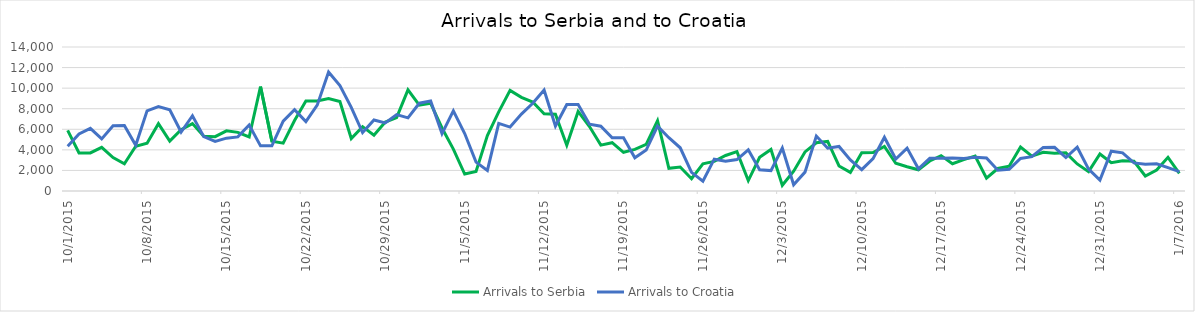
| Category | Arrivals to Serbia | Arrivals to Croatia |
|---|---|---|
| 10/1/15 | 5900 | 4344 |
| 10/2/15 | 3700 | 5546 |
| 10/3/15 | 3700 | 6086 |
| 10/4/15 | 4250 | 5065 |
| 10/5/15 | 3250 | 6338 |
| 10/6/15 | 2650 | 6370 |
| 10/7/15 | 4350 | 4446 |
| 10/8/15 | 4650 | 7798 |
| 10/9/15 | 6550 | 8201 |
| 10/10/15 | 4850 | 7896 |
| 10/11/15 | 5950 | 5732 |
| 10/12/15 | 6556 | 7317 |
| 10/13/15 | 5330 | 5286 |
| 10/14/15 | 5280 | 4814 |
| 10/15/15 | 5850 | 5138 |
| 10/16/15 | 5700 | 5260 |
| 10/17/15 | 5250 | 6415 |
| 10/18/15 | 10150 | 4390 |
| 10/19/15 | 4850 | 4388 |
| 10/20/15 | 4650 | 6793 |
| 10/21/15 | 6850 | 7900 |
| 10/22/15 | 8750 | 6748 |
| 10/23/15 | 8750 | 8348 |
| 10/24/15 | 9000 | 11570 |
| 10/25/15 | 8700 | 10249 |
| 10/26/15 | 5100 | 8128 |
| 10/27/15 | 6257 | 5683 |
| 10/28/15 | 5415 | 6900 |
| 10/29/15 | 6700 | 6615 |
| 10/30/15 | 7138 | 7429 |
| 10/31/15 | 9834 | 7110 |
| 11/1/15 | 8354 | 8534 |
| 11/2/15 | 8521 | 8746 |
| 11/3/15 | 6129 | 5573 |
| 11/4/15 | 4073 | 7792 |
| 11/5/15 | 1652 | 5587 |
| 11/6/15 | 1906 | 2809 |
| 11/7/15 | 5397 | 2000 |
| 11/8/15 | 7695 | 6579 |
| 11/9/15 | 9785 | 6214 |
| 11/10/15 | 9107 | 7474 |
| 11/11/15 | 8648 | 8524 |
| 11/12/15 | 7500 | 9823 |
| 11/13/15 | 7464 | 6314 |
| 11/14/15 | 4453 | 8405 |
| 11/15/15 | 7734 | 8415 |
| 11/16/15 | 6267 | 6490 |
| 11/17/15 | 4460 | 6304 |
| 11/18/15 | 4694 | 5180 |
| 11/19/15 | 3765 | 5167 |
| 11/20/15 | 4042 | 3230 |
| 11/21/15 | 4527 | 3977 |
| 11/22/15 | 6826 | 6305 |
| 11/23/15 | 2201 | 5184 |
| 11/24/15 | 2335 | 4203 |
| 11/25/15 | 1194 | 1808 |
| 11/26/15 | 2636 | 952 |
| 11/27/15 | 2878 | 3095 |
| 11/28/15 | 3454 | 2886 |
| 11/29/15 | 3825 | 3060 |
| 11/30/15 | 1009 | 4009 |
| 12/1/15 | 3284 | 2066 |
| 12/2/15 | 4040 | 1982 |
| 12/3/15 | 553 | 4174 |
| 12/4/15 | 1927 | 611 |
| 12/5/15 | 3799 | 1835 |
| 12/6/15 | 4686 | 5339 |
| 12/7/15 | 4823 | 4162 |
| 12/8/15 | 2437 | 4335 |
| 12/9/15 | 1807 | 3027 |
| 12/10/15 | 3723 | 2076 |
| 12/11/15 | 3747 | 3149 |
| 12/12/15 | 4339 | 5225 |
| 12/13/15 | 2698 | 3112 |
| 12/14/15 | 2353 | 4174 |
| 12/15/15 | 2067 | 2160 |
| 12/16/15 | 2916 | 3177 |
| 12/17/15 | 3438 | 3192 |
| 12/18/15 | 2649 | 3200 |
| 12/19/15 | 3052 | 3156 |
| 12/20/15 | 3405 | 3276 |
| 12/21/15 | 1253 | 3210 |
| 12/22/15 | 2186 | 2027 |
| 12/23/15 | 2415 | 2116 |
| 12/24/15 | 4279 | 3166 |
| 12/25/15 | 3390 | 3339 |
| 12/26/15 | 3757 | 4241 |
| 12/27/15 | 3674 | 4251 |
| 12/28/15 | 3708 | 3249 |
| 12/29/15 | 2629 | 4253 |
| 12/30/15 | 1879 | 2132 |
| 12/31/15 | 3602 | 1058 |
| 1/1/16 | 2745 | 3869 |
| 1/2/16 | 2947 | 3710 |
| 1/3/16 | 2889 | 2732 |
| 1/4/16 | 1462 | 2591 |
| 1/5/16 | 2041 | 2650 |
| 1/6/16 | 3273 | 2273 |
| 1/7/16 | 1715 | 1884 |